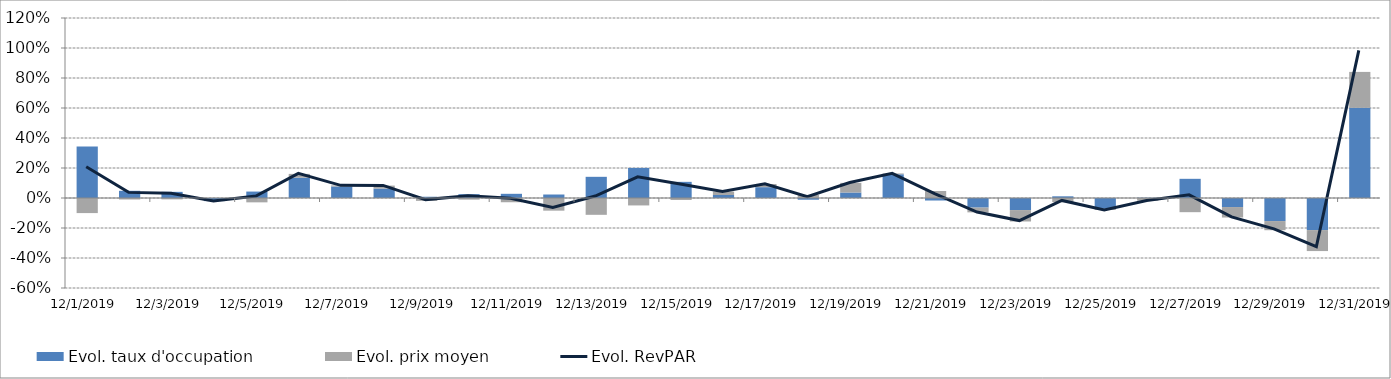
| Category | Evol. taux d'occupation | Evol. prix moyen |
|---|---|---|
| 12/1/19 | 0.343 | -0.101 |
| 12/2/19 | 0.048 | -0.01 |
| 12/3/19 | 0.041 | -0.009 |
| 12/4/19 | -0.021 | 0 |
| 12/5/19 | 0.043 | -0.029 |
| 12/6/19 | 0.135 | 0.025 |
| 12/7/19 | 0.077 | 0.007 |
| 12/8/19 | 0.063 | 0.02 |
| 12/9/19 | 0.008 | -0.019 |
| 12/10/19 | 0.026 | -0.011 |
| 12/11/19 | 0.028 | -0.028 |
| 12/12/19 | 0.023 | -0.084 |
| 12/13/19 | 0.141 | -0.112 |
| 12/14/19 | 0.2 | -0.05 |
| 12/15/19 | 0.108 | -0.013 |
| 12/16/19 | 0.02 | 0.023 |
| 12/17/19 | 0.072 | 0.021 |
| 12/18/19 | -0.011 | 0.021 |
| 12/19/19 | 0.037 | 0.064 |
| 12/20/19 | 0.158 | 0.005 |
| 12/21/19 | -0.017 | 0.047 |
| 12/22/19 | -0.064 | -0.032 |
| 12/23/19 | -0.081 | -0.076 |
| 12/24/19 | 0.011 | -0.027 |
| 12/25/19 | -0.072 | -0.008 |
| 12/26/19 | 0.002 | -0.018 |
| 12/27/19 | 0.128 | -0.095 |
| 12/28/19 | -0.06 | -0.07 |
| 12/29/19 | -0.154 | -0.061 |
| 12/30/19 | -0.214 | -0.14 |
| 12/31/19 | 0.601 | 0.24 |